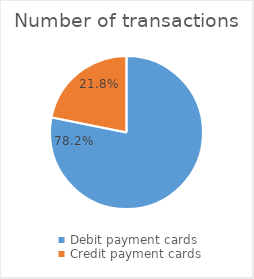
| Category | Number of transactions |
|---|---|
| Debit payment cards | 296901841 |
| Credit payment cards | 82909317 |